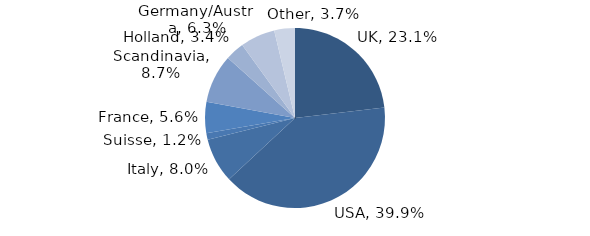
| Category | Investment Style |
|---|---|
| UK | 0.231 |
| USA | 0.399 |
| Italy | 0.08 |
| Suisse | 0.012 |
| France | 0.056 |
| Scandinavia | 0.087 |
| Holland | 0.034 |
| Germany/Austria | 0.063 |
| Other | 0.037 |